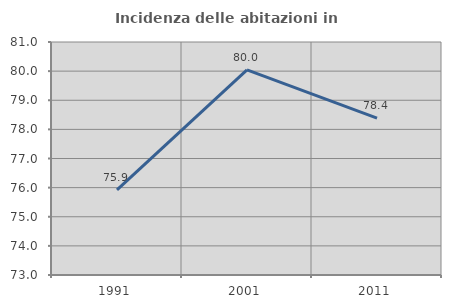
| Category | Incidenza delle abitazioni in proprietà  |
|---|---|
| 1991.0 | 75.921 |
| 2001.0 | 80.044 |
| 2011.0 | 78.384 |